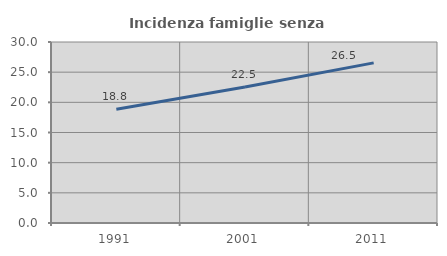
| Category | Incidenza famiglie senza nuclei |
|---|---|
| 1991.0 | 18.846 |
| 2001.0 | 22.531 |
| 2011.0 | 26.542 |